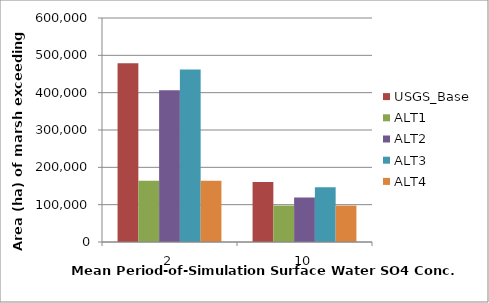
| Category | USGS_Base | ALT1 | ALT2 | ALT3 | ALT4 |
|---|---|---|---|---|---|
| 2.0 | 479025 | 164375 | 406675 | 461875 | 164350 |
| 10.0 | 160475 | 97625 | 119250 | 146800 | 97625 |